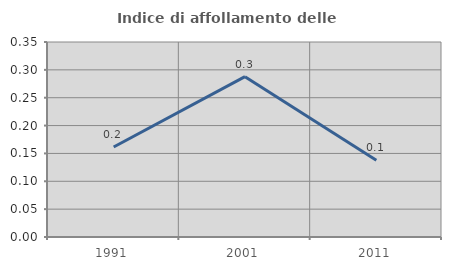
| Category | Indice di affollamento delle abitazioni  |
|---|---|
| 1991.0 | 0.162 |
| 2001.0 | 0.288 |
| 2011.0 | 0.138 |